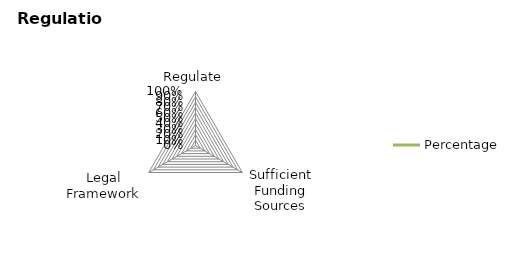
| Category | Percentage |
|---|---|
| Regulate | 0 |
| Sufficient Funding Sources | 0 |
| Legal Framework | 0 |